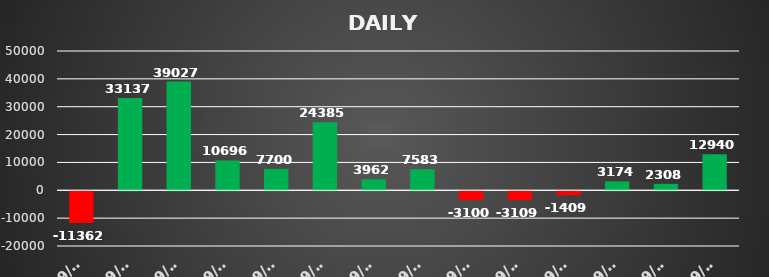
| Category | Series 0 |
|---|---|
| 2021-09-01 | -11362.08 |
| 2021-09-02 | 33137.1 |
| 2021-09-03 | 39027.06 |
| 2021-09-06 | 10695.58 |
| 2021-09-07 | 7699.9 |
| 2021-09-08 | 24385.28 |
| 2021-09-13 | 3962.16 |
| 2021-09-14 | 7583.065 |
| 2021-09-15 | -3099.974 |
| 2021-09-20 | -3108.7 |
| 2021-09-21 | -1409.12 |
| 2021-09-23 | 3174.32 |
| 2021-09-27 | 2308.39 |
| 2021-09-29 | 12940.2 |